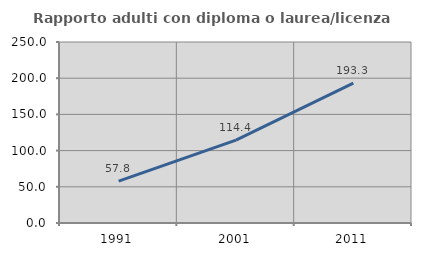
| Category | Rapporto adulti con diploma o laurea/licenza media  |
|---|---|
| 1991.0 | 57.812 |
| 2001.0 | 114.433 |
| 2011.0 | 193.333 |